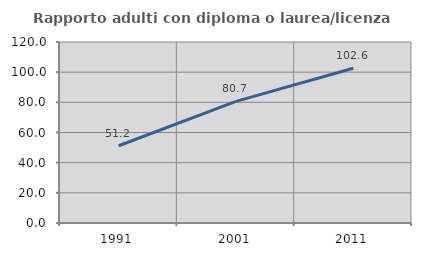
| Category | Rapporto adulti con diploma o laurea/licenza media  |
|---|---|
| 1991.0 | 51.2 |
| 2001.0 | 80.663 |
| 2011.0 | 102.552 |